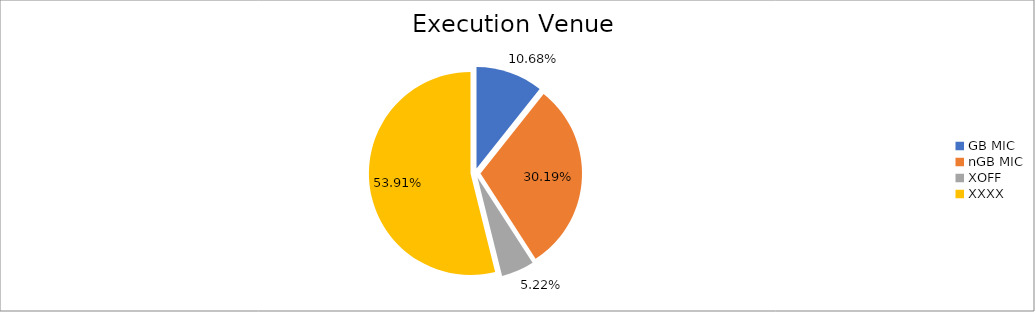
| Category | Series 0 |
|---|---|
| GB MIC | 1043669.222 |
| nGB MIC | 2948985.567 |
| XOFF | 510292.4 |
| XXXX | 5265949.839 |